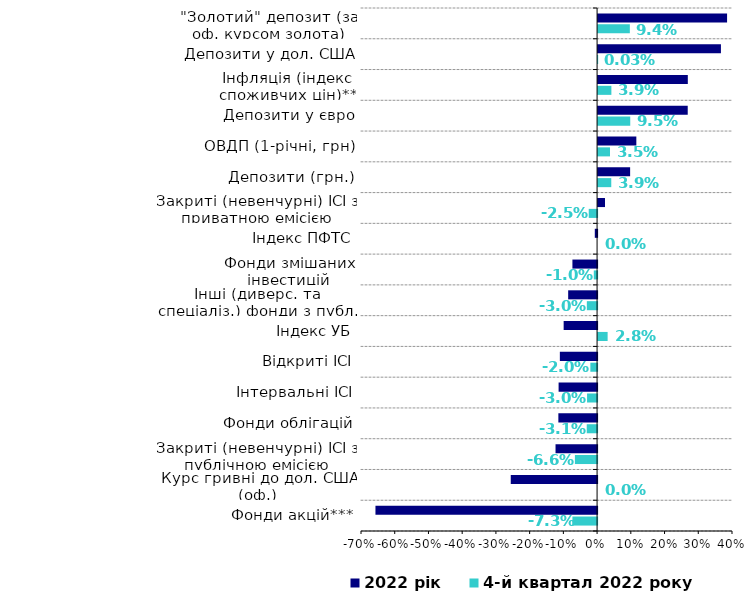
| Category | 4-й квартал 2022 року | 2022 рік |
|---|---|---|
| Фонди акцій*** | -0.073 | -0.657 |
| Курс гривні до дол. США (оф.) | 0 | -0.256 |
| Закриті (невенчурні) ІСІ з публічною емісією | -0.066 | -0.123 |
| Фонди облігацій | -0.031 | -0.115 |
| Інтервальні ІСІ | -0.03 | -0.114 |
| Відкриті ІСІ | -0.02 | -0.11 |
| Індекс УБ | 0.028 | -0.099 |
| Інші (диверс. та спеціаліз.) фонди з публ. емісією | -0.03 | -0.086 |
| Фонди змішаних інвестицій | -0.01 | -0.073 |
| Індекс ПФТС | 0 | -0.007 |
| Закриті (невенчурні) ІСІ з приватною емісією | -0.025 | 0.02 |
| Депозити (грн.) | 0.039 | 0.095 |
| ОВДП (1-річні, грн) | 0.035 | 0.113 |
| Депозити у євро | 0.095 | 0.266 |
| Інфляція (індекс споживчих цін)** | 0.039 | 0.266 |
| Депозити у дол. США | 0 | 0.364 |
| "Золотий" депозит (за оф. курсом золота) | 0.094 | 0.382 |